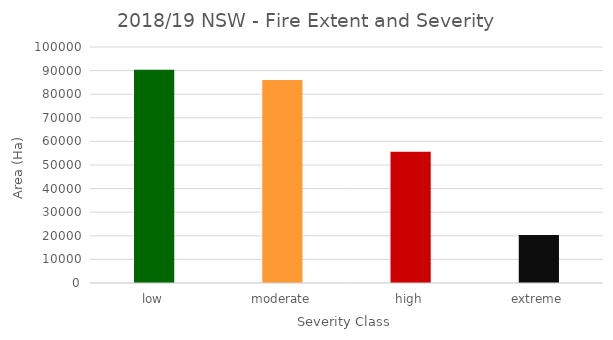
| Category | low |
|---|---|
| low | 90400 |
| moderate | 86000 |
| high | 55600 |
| extreme | 20300 |